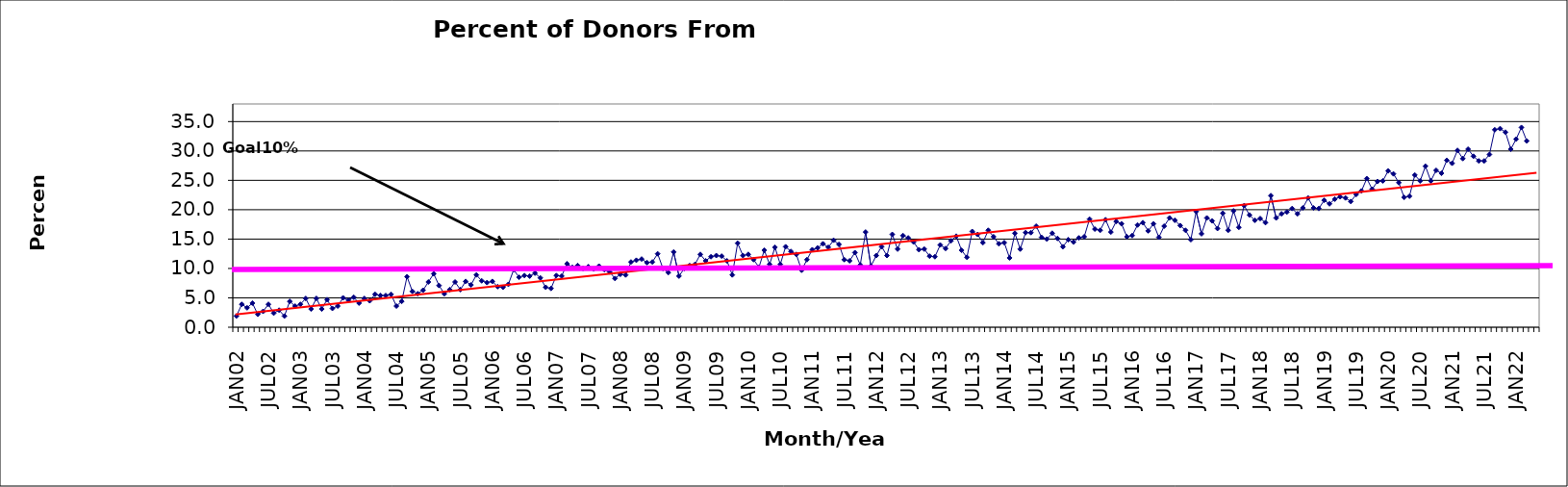
| Category | Series 0 |
|---|---|
| JAN02 | 1.9 |
| FEB02 | 3.9 |
| MAR02 | 3.3 |
| APR02 | 4.1 |
| MAY02 | 2.2 |
| JUN02 | 2.7 |
| JUL02 | 3.9 |
| AUG02 | 2.4 |
| SEP02 | 2.9 |
| OCT02 | 1.9 |
| NOV02 | 4.4 |
| DEC02 | 3.6 |
| JAN03 | 3.9 |
| FEB03 | 4.9 |
| MAR03 | 3.1 |
| APR03 | 4.9 |
| MAY03 | 3.1 |
| JUN03 | 4.7 |
| JUL03 | 3.2 |
| AUG03 | 3.6 |
| SEP03 | 5 |
| OCT03 | 4.6 |
| NOV03 | 5.1 |
| DEC03 | 4.1 |
| JAN04 | 4.9 |
| FEB04 | 4.5 |
| MAR04 | 5.6 |
| APR04 | 5.4 |
| MAY04 | 5.4 |
| JUN04 | 5.6 |
| JUL04 | 3.6 |
| AUG04 | 4.4 |
| SEP04 | 8.6 |
| OCT04 | 6.1 |
| NOV04 | 5.7 |
| DEC04 | 6.3 |
| JAN05 | 7.7 |
| FEB05 | 9.1 |
| MAR05 | 7.1 |
| APR05 | 5.7 |
| MAY05 | 6.4 |
| JUN05 | 7.7 |
| JUL05 | 6.4 |
| AUG05 | 7.8 |
| SEP05 | 7.2 |
| OCT05 | 8.9 |
| NOV05 | 7.9 |
| DEC05 | 7.6 |
| JAN06 | 7.8 |
| FEB06 | 6.9 |
| MAR06 | 6.8 |
| APR06 | 7.3 |
| MAY06 | 9.8 |
| JUN06 | 8.5 |
| JUL06 | 8.8 |
| AUG06 | 8.7 |
| SEP06 | 9.2 |
| OCT06 | 8.4 |
| NOV06 | 6.8 |
| DEC06 | 6.6 |
| JAN07 | 8.8 |
| FEB07 | 8.7 |
| MAR07 | 10.8 |
| APR07 | 10.2 |
| MAY07 | 10.5 |
| JUN07 | 10 |
| JUL07 | 10.3 |
| AUG07 | 9.9 |
| SEP07 | 10.4 |
| OCT07 | 9.8 |
| NOV07 | 9.4 |
| DEC07 | 8.3 |
| JAN08 | 9 |
| FEB08 | 8.9 |
| MAR08 | 11.1 |
| APR08 | 11.4 |
| MAY08 | 11.6 |
| JUN08 | 11 |
| JUL08 | 11.1 |
| AUG08 | 12.5 |
| SEP08 | 10 |
| OCT08 | 9.3 |
| NOV08 | 12.8 |
| DEC08 | 8.7 |
| JAN09 | 10 |
| FEB09 | 10.5 |
| MAR09 | 10.7 |
| APR09 | 12.4 |
| MAY09 | 11.3 |
| JUN09 | 12 |
| JUL09 | 12.2 |
| AUG09 | 12.1 |
| SEP09 | 11.3 |
| OCT09 | 8.9 |
| NOV09 | 14.3 |
| DEC09 | 12.2 |
| JAN10 | 12.4 |
| FEB10 | 11.5 |
| MAR10 | 10.2 |
| APR10 | 13.1 |
| MAY10 | 10.7 |
| JUN10 | 13.6 |
| JUL10 | 10.7 |
| AUG10 | 13.7 |
| SEP10 | 12.9 |
| OCT10 | 12.4 |
| NOV10 | 9.7 |
| DEC10 | 11.5 |
| JAN11 | 13.2 |
| FEB11 | 13.5 |
| MAR11 | 14.2 |
| APR11 | 13.6 |
| MAY11 | 14.8 |
| JUN11 | 14.1 |
| JUL11 | 11.5 |
| AUG11 | 11.3 |
| SEP11 | 12.7 |
| OCT11 | 10.6 |
| NOV11 | 16.2 |
| DEC11 | 10.4 |
| JAN12 | 12.2 |
| FEB12 | 13.7 |
| MAR12 | 12.2 |
| APR12 | 15.8 |
| MAY12 | 13.3 |
| JUN12 | 15.6 |
| JUL12 | 15.2 |
| AUG12 | 14.5 |
| SEP12 | 13.2 |
| OCT12 | 13.3 |
| NOV12 | 12.1 |
| DEC12 | 12 |
| JAN13 | 14 |
| FEB13 | 13.4 |
| MAR13 | 14.7 |
| APR13 | 15.5 |
| MAY13 | 13.1 |
| JUN13 | 11.9 |
| JUL13 | 16.3 |
| AUG13 | 15.8 |
| SEP13 | 14.4 |
| OCT13 | 16.5 |
| NOV13 | 15.4 |
| DEC13 | 14.2 |
| JAN14 | 14.4 |
| FEB14 | 11.8 |
| MAR14 | 16 |
| APR14 | 13.3 |
| MAY14 | 16.1 |
| JUN14 | 16.1 |
| JUL14 | 17.2 |
| AUG14 | 15.3 |
| SEP14 | 15 |
| OCT14 | 16 |
| NOV14 | 15.1 |
| DEC14 | 13.7 |
| JAN15 | 14.9 |
| FEB15 | 14.5 |
| MAR15 | 15.2 |
| APR15 | 15.4 |
| MAY15 | 18.4 |
| JUN15 | 16.7 |
| JUL15 | 16.5 |
| AUG15 | 18.3 |
| SEP15 | 16.2 |
| OCT15 | 18 |
| NOV15 | 17.6 |
| DEC15 | 15.4 |
| JAN16 | 15.6 |
| FEB16 | 17.4 |
| MAR16 | 17.8 |
| APR16 | 16.4 |
| MAY16 | 17.6 |
| JUN16 | 15.3 |
| JUL16 | 17.2 |
| AUG16 | 18.6 |
| SEP16 | 18.2 |
| OCT16 | 17.3 |
| NOV16 | 16.5 |
| DEC16 | 14.9 |
| JAN17 | 19.7 |
| FEB17 | 15.9 |
| MAR17 | 18.6 |
| APR17 | 18.1 |
| MAY17 | 16.8 |
| JUN17 | 19.4 |
| JUL17 | 16.5 |
| AUG17 | 19.8 |
| SEP17 | 17 |
| OCT17 | 20.7 |
| NOV17 | 19.1 |
| DEC17 | 18.2 |
| JAN18 | 18.5 |
| FEB18 | 17.8 |
| MAR18 | 22.4 |
| APR18 | 18.6 |
| MAY18 | 19.3 |
| JUN18 | 19.6 |
| JUL18 | 20.2 |
| AUG18 | 19.3 |
| SEP18 | 20.3 |
| OCT18 | 22 |
| NOV18 | 20.3 |
| DEC18 | 20.2 |
| JAN19 | 21.6 |
| FEB19 | 21 |
| MAR19 | 21.8 |
| APR19 | 22.2 |
| MAY19 | 22 |
| JUN19 | 21.4 |
| JUL19 | 22.6 |
| AUG19 | 23.2 |
| SEP19 | 25.3 |
| OCT19 | 23.5 |
| NOV19 | 24.8 |
| DEC19 | 24.9 |
| JAN20 | 26.6 |
| FEB20 | 26.1 |
| MAR20 | 24.6 |
| APR20 | 22.1 |
| MAY20 | 22.3 |
| JUN20 | 25.9 |
| JUL20 | 24.9 |
| AUG20 | 27.4 |
| SEP20 | 24.9 |
| OCT20 | 26.7 |
| NOV20 | 26.2 |
| DEC20 | 28.4 |
| JAN21 | 27.9 |
| FEB21 | 30.1 |
| MAR21 | 28.7 |
| APR21 | 30.3 |
| MAY21 | 29.1 |
| JUN21 | 28.3 |
| JUL21 | 28.3 |
| AUG21 | 29.4 |
| SEP21 | 33.6 |
| OCT21 | 33.8 |
| NOV21 | 33.2 |
| DEC21 | 30.3 |
| JAN22 | 32 |
| FEB22 | 34 |
| MAR22 | 31.7 |